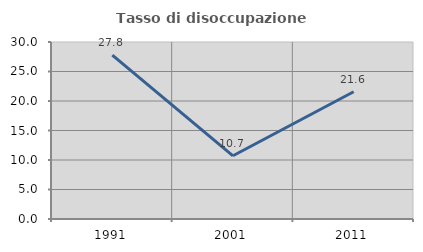
| Category | Tasso di disoccupazione giovanile  |
|---|---|
| 1991.0 | 27.778 |
| 2001.0 | 10.714 |
| 2011.0 | 21.569 |